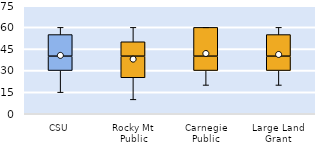
| Category | 25th | 50th | 75th |
|---|---|---|---|
| CSU | 30 | 10 | 15 |
| Rocky Mt Public | 25 | 15 | 10 |
| Carnegie Public | 30 | 10 | 20 |
| Large Land Grant | 30 | 10 | 15 |